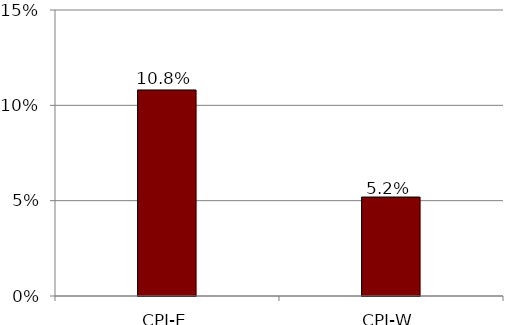
| Category | Medical care |
|---|---|
| CPI-E | 0.108 |
| CPI-W | 0.052 |